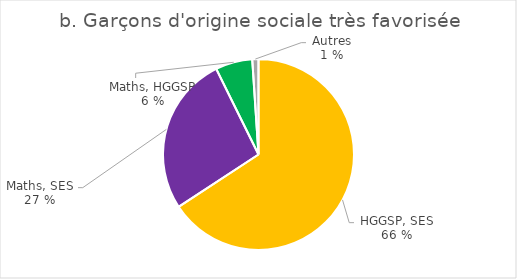
| Category | Garçons d'origine sociale très favorisée |
|---|---|
| HGGSP, SES | 4200 |
| Mathématiques, SES | 1720 |
| Mathématiques, HGGSP | 399 |
| Autres | 67 |